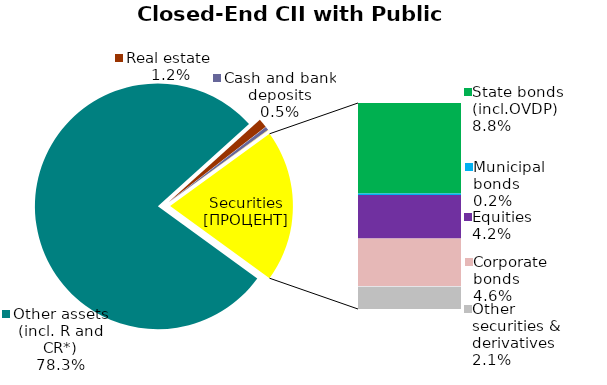
| Category | Series 0 |
|---|---|
| Other assets (incl. R and CR*) | 0.783 |
| Real estate  | 0.012 |
| Cash and bank deposits | 0.005 |
| Bank metals | 0 |
| State bonds (incl.OVDP) | 0.088 |
| Municipal bonds | 0.002 |
| Equities | 0.042 |
| Corporate bonds | 0.046 |
| Promissory notes | 0.001 |
| Other securities & derivatives | 0.021 |